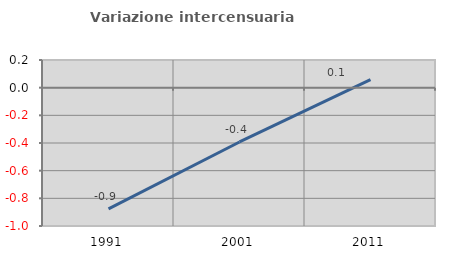
| Category | Variazione intercensuaria annua |
|---|---|
| 1991.0 | -0.876 |
| 2001.0 | -0.393 |
| 2011.0 | 0.058 |